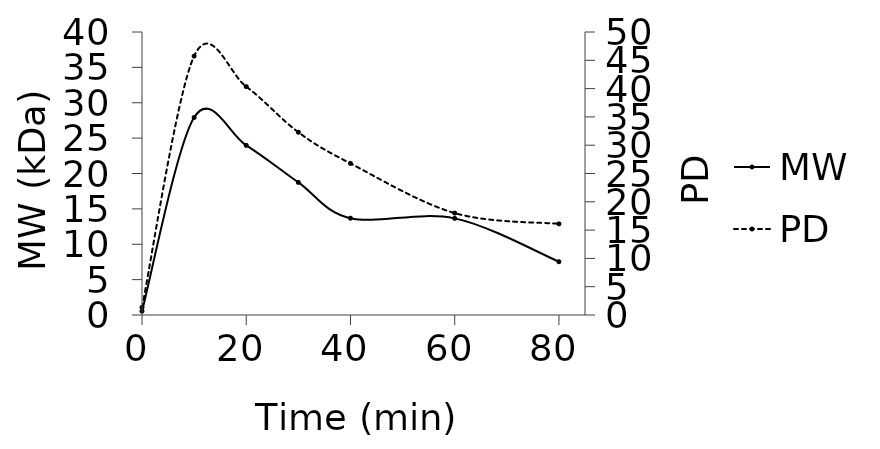
| Category | MW |
|---|---|
| 0.0 | 0.54 |
| 10.0 | 27.918 |
| 20.0 | 23.976 |
| 30.0 | 18.74 |
| 40.0 | 13.68 |
| 60.0 | 13.658 |
| 80.0 | 7.532 |